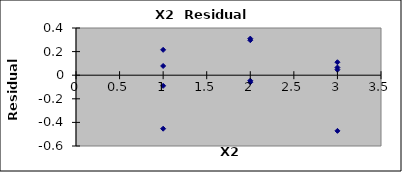
| Category | Series 0 |
|---|---|
| 1.0 | -0.09 |
| 1.0 | 0.078 |
| 1.0 | -0.453 |
| 1.0 | 0.215 |
| 2.0 | 0.31 |
| 2.0 | -0.047 |
| 2.0 | 0.297 |
| 2.0 | -0.06 |
| 3.0 | 0.11 |
| 3.0 | -0.472 |
| 3.0 | 0.047 |
| 3.0 | 0.065 |